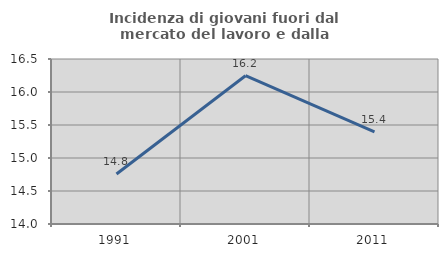
| Category | Incidenza di giovani fuori dal mercato del lavoro e dalla formazione  |
|---|---|
| 1991.0 | 14.757 |
| 2001.0 | 16.246 |
| 2011.0 | 15.394 |